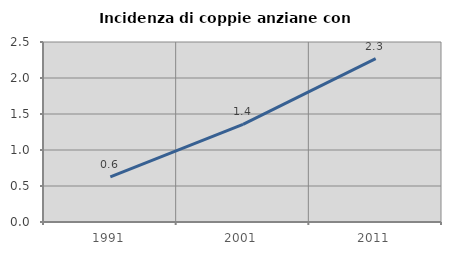
| Category | Incidenza di coppie anziane con figli |
|---|---|
| 1991.0 | 0.627 |
| 2001.0 | 1.355 |
| 2011.0 | 2.269 |